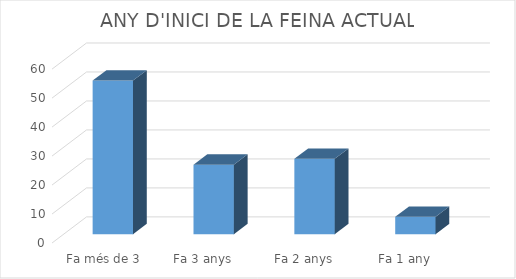
| Category | Series 0 |
|---|---|
| Fa més de 3 anys | 53 |
| Fa 3 anys | 24 |
| Fa 2 anys | 26 |
| Fa 1 any | 6 |